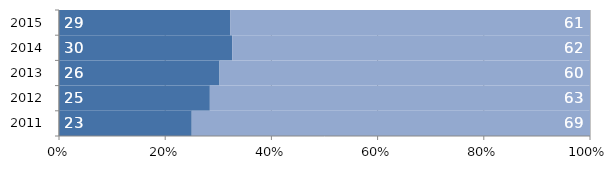
| Category | Selected variable OTHER VARIABLE COST | Selected variable OTHER COST |
|---|---|---|
| 2011 | 23 | 69 |
| 2012 | 25 | 63 |
| 2013 | 26 | 60 |
| 2014 | 30 | 62 |
| 2015 | 29 | 61 |